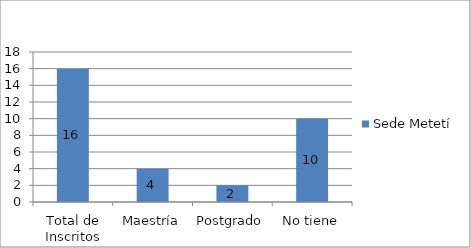
| Category | Sede Metetí |
|---|---|
| Total de Inscritos | 16 |
| Maestría | 4 |
| Postgrado | 2 |
| No tiene | 10 |